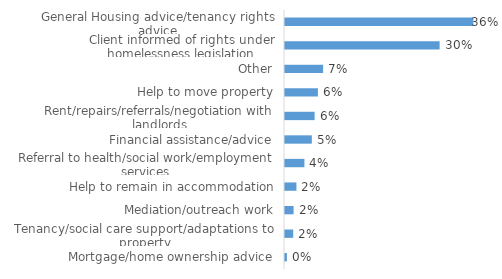
| Category | 2020-21 |
|---|---|
| Mortgage/home ownership advice | 0.004 |
| Tenancy/social care support/adaptations to property | 0.016 |
| Mediation/outreach work | 0.017 |
| Help to remain in accommodation | 0.022 |
| Referral to health/social work/employment services | 0.037 |
| Financial assistance/advice | 0.052 |
| Rent/repairs/referrals/negotiation with landlords | 0.057 |
| Help to move property | 0.063 |
| Other | 0.073 |
| Client informed of rights under homelessness legislation | 0.297 |
| General Housing advice/tenancy rights advice | 0.362 |